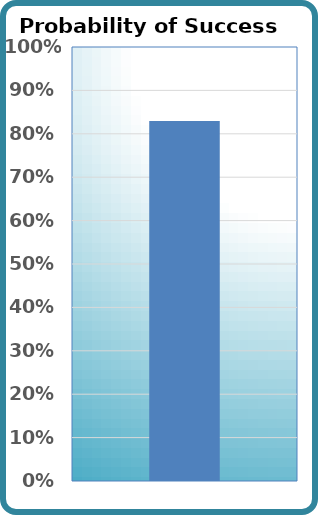
| Category | Probability of Success |
|---|---|
| 0 | 0.829 |